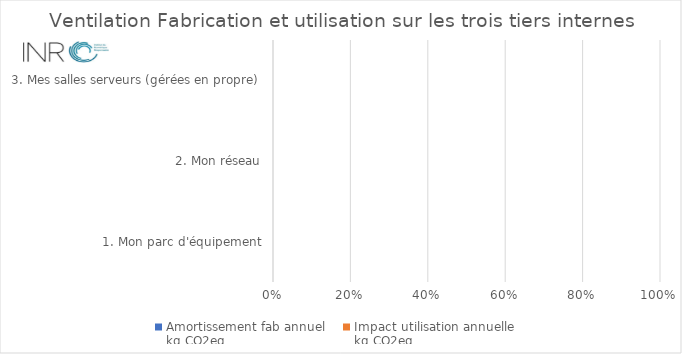
| Category | Amortissement fab annuel
kg CO2eq | Impact utilisation annuelle
kg CO2eq |
|---|---|---|
| 1. Mon parc d'équipement | 0 | 0 |
| 2. Mon réseau | 0 | 0 |
| 3. Mes salles serveurs (gérées en propre) | 0 | 0 |